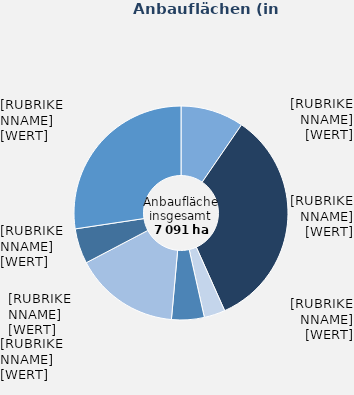
| Category | Anbauflächen |
|---|---|
| Rotkohl | 679 |
| Weißkohl | 2392 |
| Wirsing | 226 |
| Blumenkohl | 350 |
| Speisemöhren/ Karotten | 1126 |
| Spargel im Ertrag stehend | 377 |
| Sonstige | 1941 |